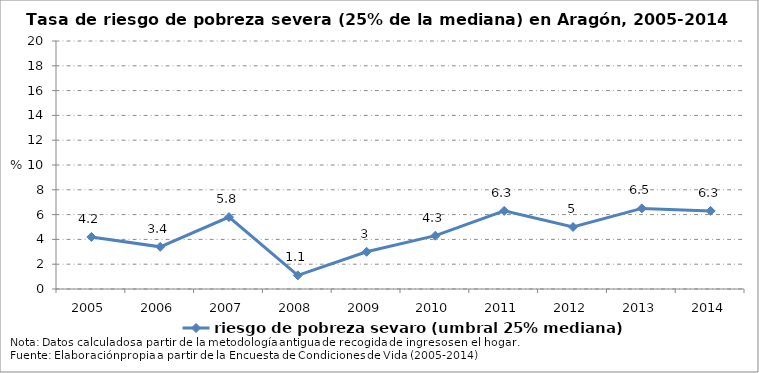
| Category | riesgo de pobreza sevaro (umbral 25% mediana) |
|---|---|
| 2005.0 | 4.2 |
| 2006.0 | 3.4 |
| 2007.0 | 5.8 |
| 2008.0 | 1.1 |
| 2009.0 | 3 |
| 2010.0 | 4.3 |
| 2011.0 | 6.3 |
| 2012.0 | 5 |
| 2013.0 | 6.5 |
| 2014.0 | 6.3 |